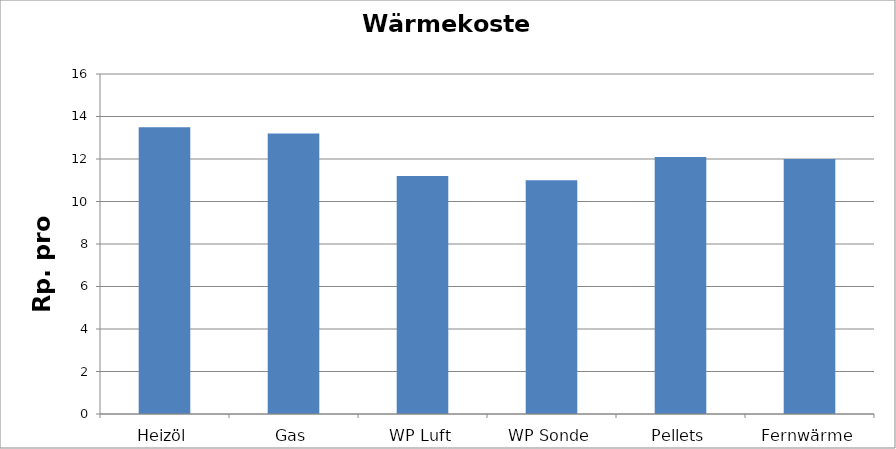
| Category | Wärmekosten [Rp./kWh] |
|---|---|
| Heizöl | 13.5 |
| Gas | 13.2 |
| WP Luft | 11.2 |
| WP Sonde | 11 |
| Pellets | 12.1 |
| Fernwärme | 12 |